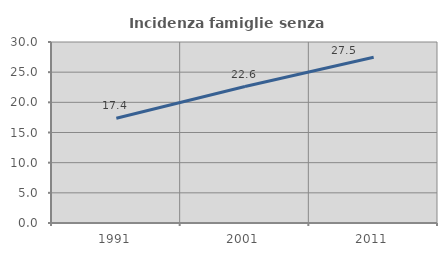
| Category | Incidenza famiglie senza nuclei |
|---|---|
| 1991.0 | 17.365 |
| 2001.0 | 22.622 |
| 2011.0 | 27.482 |